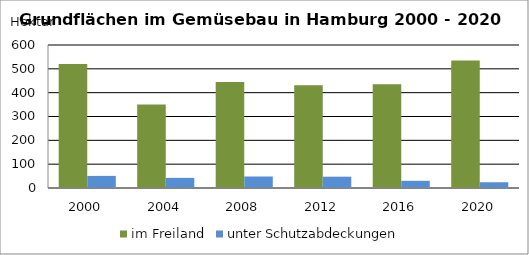
| Category | im Freiland | unter Schutzabdeckungen |
|---|---|---|
| 2000.0 | 520.2 | 50.7 |
| 2004.0 | 350.5 | 42.5 |
| 2008.0 | 444.4 | 48.3 |
| 2012.0 | 430.7 | 47.5 |
| 2016.0 | 435.7 | 30.2 |
| 2020.0 | 535.1 | 24.2 |